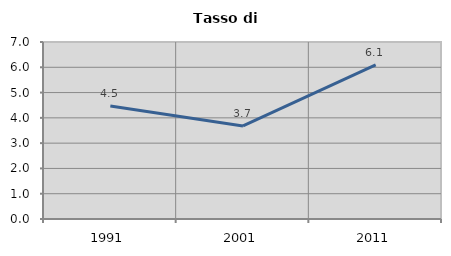
| Category | Tasso di disoccupazione   |
|---|---|
| 1991.0 | 4.467 |
| 2001.0 | 3.682 |
| 2011.0 | 6.097 |